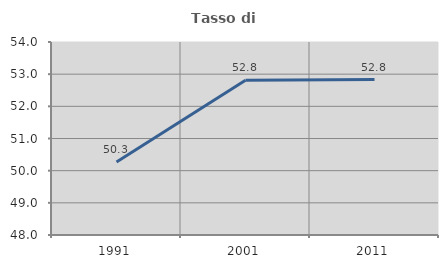
| Category | Tasso di occupazione   |
|---|---|
| 1991.0 | 50.268 |
| 2001.0 | 52.808 |
| 2011.0 | 52.832 |